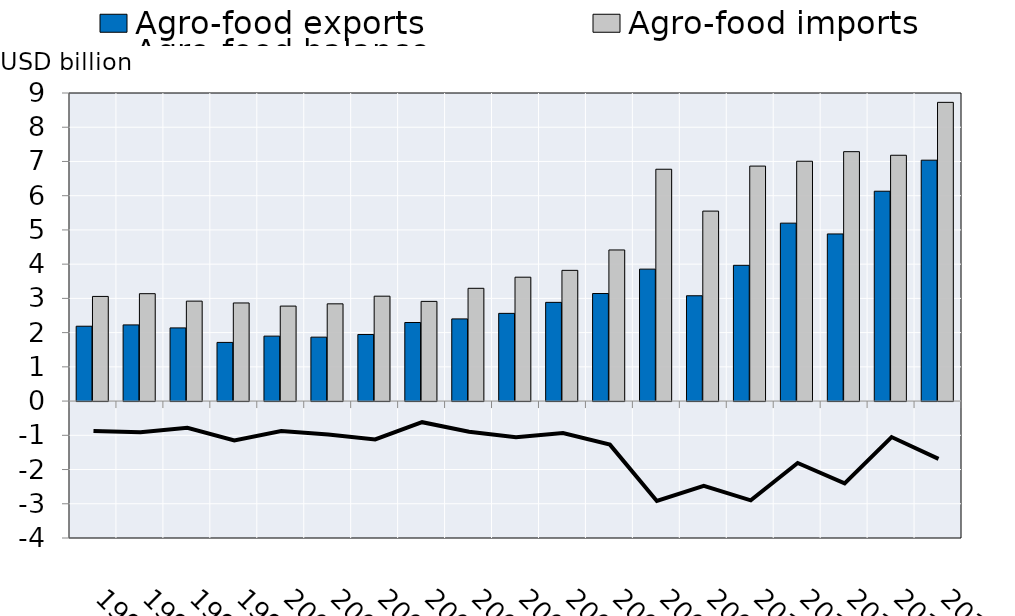
| Category | Agro-food exports | Agro-food imports |
|---|---|---|
| 1996.0 | 2.187 | 3.057 |
| 1997.0 | 2.226 | 3.138 |
| 1998.0 | 2.138 | 2.92 |
| 1999.0 | 1.714 | 2.866 |
| 2000.0 | 1.897 | 2.775 |
| 2001.0 | 1.867 | 2.841 |
| 2002.0 | 1.945 | 3.064 |
| 2003.0 | 2.295 | 2.912 |
| 2004.0 | 2.401 | 3.294 |
| 2005.0 | 2.562 | 3.619 |
| 2006.0 | 2.884 | 3.819 |
| 2007.0 | 3.142 | 4.414 |
| 2008.0 | 3.855 | 6.773 |
| 2009.0 | 3.077 | 5.55 |
| 2010.0 | 3.966 | 6.865 |
| 2011.0 | 5.198 | 7.006 |
| 2012.0 | 4.883 | 7.286 |
| 2013.0 | 6.13 | 7.181 |
| 2014.0 | 7.038 | 8.727 |